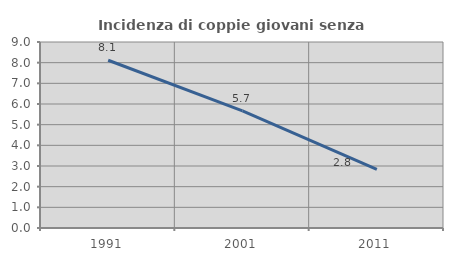
| Category | Incidenza di coppie giovani senza figli |
|---|---|
| 1991.0 | 8.117 |
| 2001.0 | 5.67 |
| 2011.0 | 2.837 |